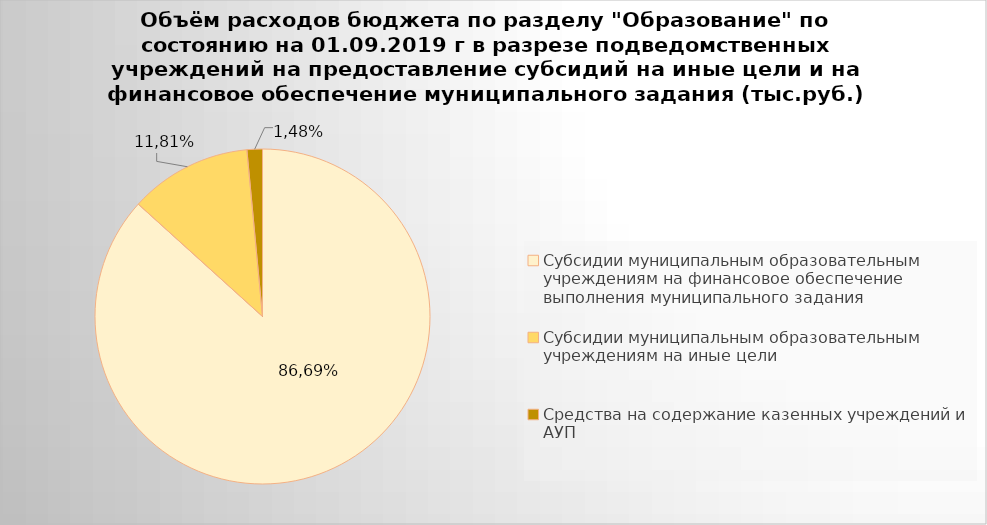
| Category | Series 0 |
|---|---|
| Субсидии муниципальным образовательным учреждениям на финансовое обеспечение выполнения муниципального задания | 4592478.55 |
| Субсидии муниципальным образовательным учреждениям на иные цели | 625769.7 |
| Средства на содержание казенных учреждений и АУП | 78789.4 |